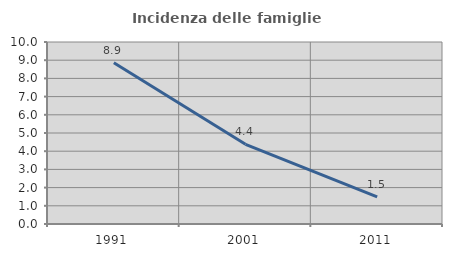
| Category | Incidenza delle famiglie numerose |
|---|---|
| 1991.0 | 8.861 |
| 2001.0 | 4.377 |
| 2011.0 | 1.495 |